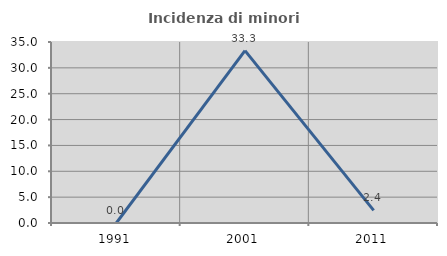
| Category | Incidenza di minori stranieri |
|---|---|
| 1991.0 | 0 |
| 2001.0 | 33.333 |
| 2011.0 | 2.439 |